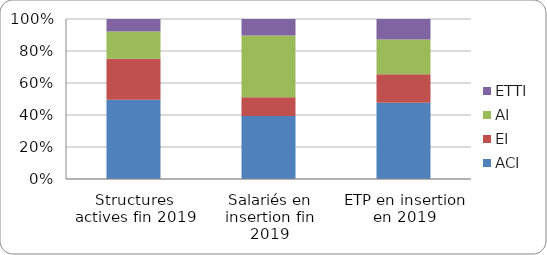
| Category | ACI | EI | AI | ETTI |
|---|---|---|---|---|
| Structures actives fin 2019 | 49.6 | 25.6 | 16.98 | 7.81 |
| Salariés en insertion fin 2019 | 39.34 | 11.73 | 38.58 | 10.33 |
| ETP en insertion en 2019 | 47.64 | 17.8 | 21.66 | 12.87 |